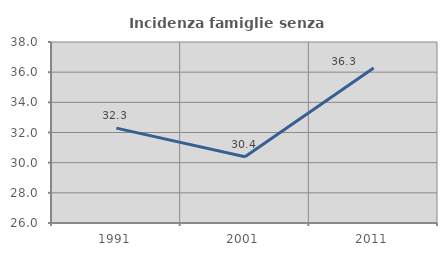
| Category | Incidenza famiglie senza nuclei |
|---|---|
| 1991.0 | 32.288 |
| 2001.0 | 30.396 |
| 2011.0 | 36.271 |